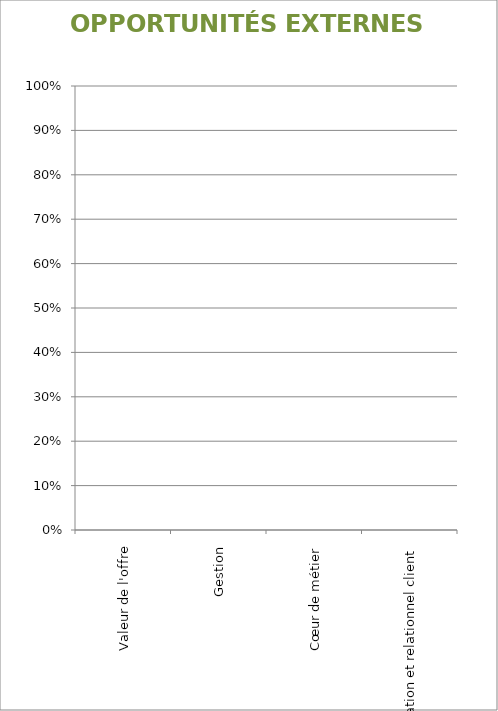
| Category | Series 0 |
|---|---|
| Valeur de l'offre | 0 |
| Gestion | 0 |
| Cœur de métier | 0 |
| Communication et relationnel client | 0 |